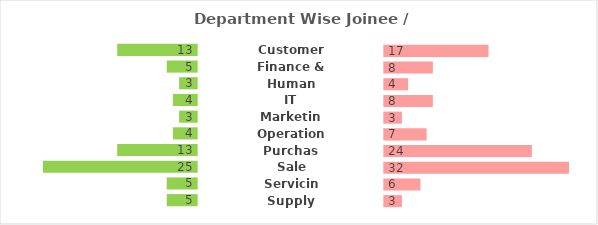
| Category | J Gap | Joinee | Gap | Resignee | R Gap |
|---|---|---|---|---|---|
| Customer Service | 17 | 13 | 30 | 17 | 13 |
| Finance & Accounts | 25 | 5 | 30 | 8 | 22 |
| Human Resource | 27 | 3 | 30 | 4 | 26 |
| IT | 26 | 4 | 30 | 8 | 22 |
| Marketing | 27 | 3 | 30 | 3 | 27 |
| Operations | 26 | 4 | 30 | 7 | 23 |
| Purchase | 17 | 13 | 30 | 24 | 6 |
| Sales | 5 | 25 | 30 | 32 | 10 |
| Servicing | 25 | 5 | 30 | 6 | 24 |
| Supply Chain | 25 | 5 | 30 | 3 | 27 |